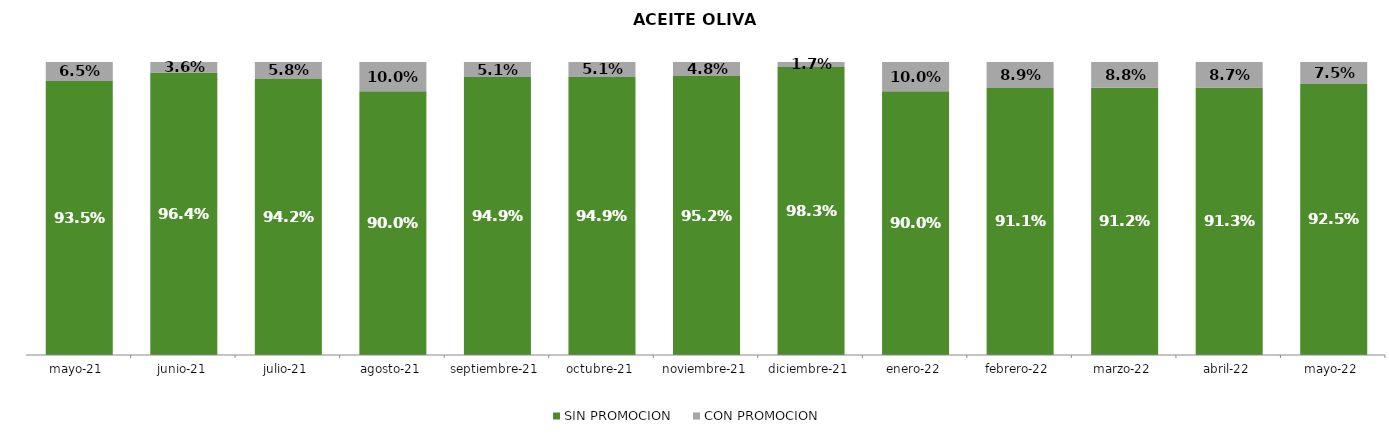
| Category | SIN PROMOCION   | CON PROMOCION   |
|---|---|---|
| 2021-05-01 | 0.935 | 0.065 |
| 2021-06-01 | 0.964 | 0.036 |
| 2021-07-01 | 0.942 | 0.058 |
| 2021-08-01 | 0.9 | 0.1 |
| 2021-09-01 | 0.949 | 0.051 |
| 2021-10-01 | 0.949 | 0.051 |
| 2021-11-01 | 0.952 | 0.048 |
| 2021-12-01 | 0.983 | 0.017 |
| 2022-01-01 | 0.9 | 0.1 |
| 2022-02-01 | 0.911 | 0.089 |
| 2022-03-01 | 0.912 | 0.088 |
| 2022-04-01 | 0.913 | 0.087 |
| 2022-05-01 | 0.925 | 0.075 |